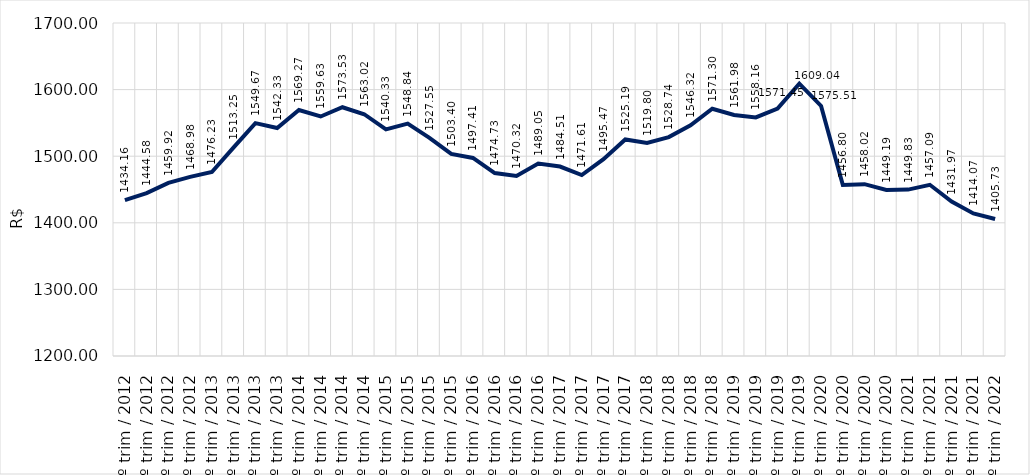
| Category | Series 0 |
|---|---|
| 1º trim / 2012 | 1434.157 |
| 2º trim / 2012 | 1444.578 |
| 3º trim / 2012 | 1459.92 |
| 4º trim / 2012 | 1468.975 |
| 1º trim / 2013 | 1476.23 |
| 2º trim / 2013 | 1513.251 |
| 3º trim / 2013 | 1549.669 |
| 4º trim / 2013 | 1542.325 |
| 1º trim / 2014 | 1569.27 |
| 2º trim / 2014 | 1559.625 |
| 3º trim / 2014 | 1573.529 |
| 4º trim / 2014 | 1563.02 |
| 1º trim / 2015 | 1540.328 |
| 2º trim / 2015 | 1548.837 |
| 3º trim / 2015 | 1527.546 |
| 4º trim / 2015 | 1503.401 |
| 1º trim / 2016 | 1497.408 |
| 2º trim / 2016 | 1474.733 |
| 3º trim / 2016 | 1470.315 |
| 4º trim / 2016 | 1489.048 |
| 1º trim / 2017 | 1484.509 |
| 2º trim / 2017 | 1471.611 |
| 3º trim / 2017 | 1495.465 |
| 4º trim / 2017 | 1525.191 |
| 1º trim / 2018 | 1519.801 |
| 2º trim / 2018 | 1528.74 |
| 3º trim / 2018 | 1546.315 |
| 4º trim / 2018 | 1571.302 |
| 1º trim / 2019 | 1561.984 |
| 2º trim / 2019 | 1558.155 |
| 3º trim / 2019 | 1571.454 |
| 4º trim / 2019 | 1609.041 |
| 1º trim / 2020 | 1575.511 |
| 2º trim / 2020 | 1456.799 |
| 3º trim / 2020 | 1458.017 |
| 4º trim / 2020 | 1449.187 |
| 1º trim / 2021 | 1449.83 |
| 2º trim / 2021 | 1457.086 |
| 3º trim / 2021 | 1431.966 |
| 4º trim / 2021 | 1414.071 |
| 1º trim / 2022 | 1405.728 |